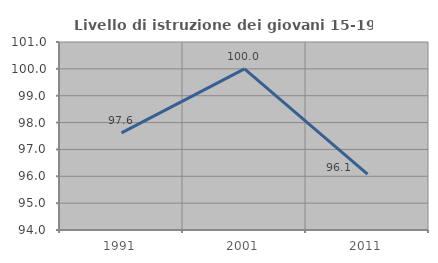
| Category | Livello di istruzione dei giovani 15-19 anni |
|---|---|
| 1991.0 | 97.619 |
| 2001.0 | 100 |
| 2011.0 | 96.078 |